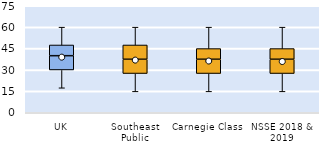
| Category | 25th | 50th | 75th |
|---|---|---|---|
| UK | 30 | 10 | 7.5 |
| Southeast Public | 27.5 | 10 | 10 |
| Carnegie Class | 27.5 | 10 | 7.5 |
| NSSE 2018 & 2019 | 27.5 | 10 | 7.5 |